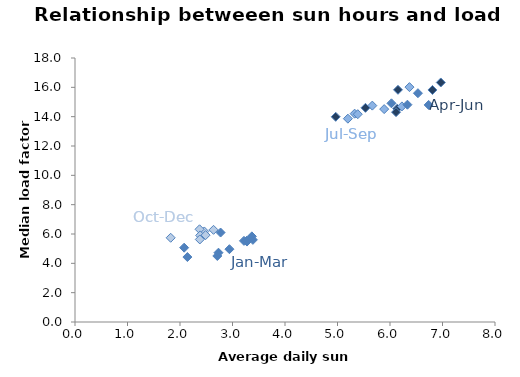
| Category | Series 0 |
|---|---|
| 6.967222329410398 | 16.331 |
| 5.32676738882561 | 14.205 |
| 2.4630795160316814 | 6.173 |
| 3.3688072999861167 | 5.839 |
| 4.966581096016139 | 13.992 |
| 5.3863345228003725 | 14.168 |
| 2.3724516449709 | 6.322 |
| 2.1409992476896385 | 4.43 |
| 6.137354795316249 | 14.541 |
| 6.370754977737338 | 16.015 |
| 2.3845848554237157 | 5.904 |
| 3.2721502536950755 | 5.542 |
| 6.115370138137039 | 14.306 |
| 6.1520707250955695 | 15.833 |
| 2.487225426234872 | 5.922 |
| 3.2759100610175564 | 5.485 |
| 6.808876871217255 | 15.82 |
| 5.663107392138812 | 14.754 |
| 1.822369497669558 | 5.742 |
| 2.941526110637134 | 4.965 |
| 5.532361392223429 | 14.604 |
| 5.88926686469665 | 14.516 |
| 2.638823681392684 | 6.284 |
| 2.7106289228147253 | 4.502 |
| 6.2275537754451005 | 14.7 |
| 5.197755143423477 | 13.863 |
| 2.3775910844841563 | 5.629 |
| 2.7328716916684077 | 4.725 |
| 6.736438638862336 | 14.8 |
| 6.532311749968212 | 15.6 |
| 2.7728147939403085 | 6.1 |
| 3.3882010762184915 | 5.6 |
| 6.027520922093358 | 14.911 |
| 6.331892650340337 | 14.816 |
| 2.079024361143101 | 5.067 |
| 3.218324128427508 | 5.533 |